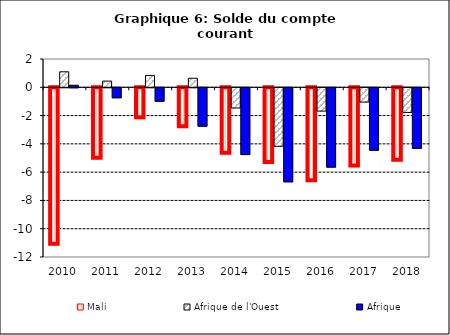
| Category | Mali | Afrique de l'Ouest | Afrique |
|---|---|---|---|
| 2010.0 | -11.142 | 1.095 | 0.144 |
| 2011.0 | -5.056 | 0.439 | -0.706 |
| 2012.0 | -2.191 | 0.839 | -0.95 |
| 2013.0 | -2.829 | 0.638 | -2.715 |
| 2014.0 | -4.697 | -1.429 | -4.722 |
| 2015.0 | -5.349 | -4.138 | -6.65 |
| 2016.0 | -6.64 | -1.65 | -5.608 |
| 2017.0 | -5.603 | -1.011 | -4.418 |
| 2018.0 | -5.187 | -1.744 | -4.278 |